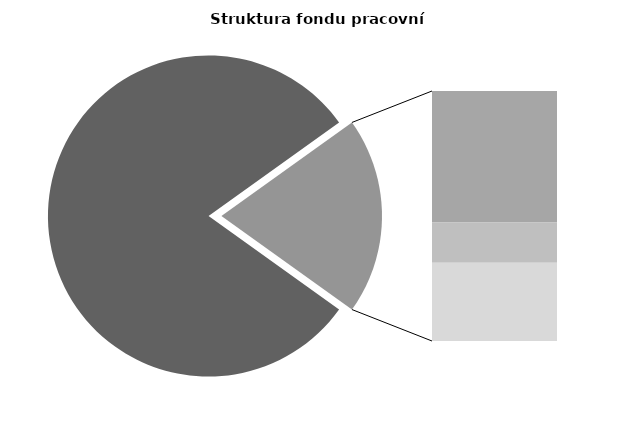
| Category | Series 0 |
|---|---|
| Průměrná měsíční odpracovaná doba bez přesčasu | 138.147 |
| Dovolená | 17.944 |
| Nemoc | 5.473 |
| Jiné | 10.673 |